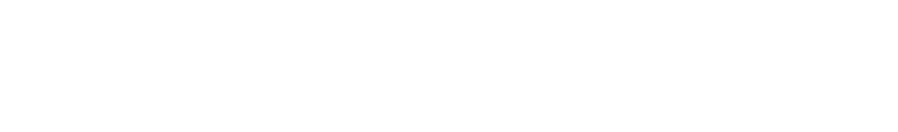
| Category | TOTAL DE PROVISÃO | DESPESAS TOTAIS |
|---|---|---|
| 0 | 0 | 0 |